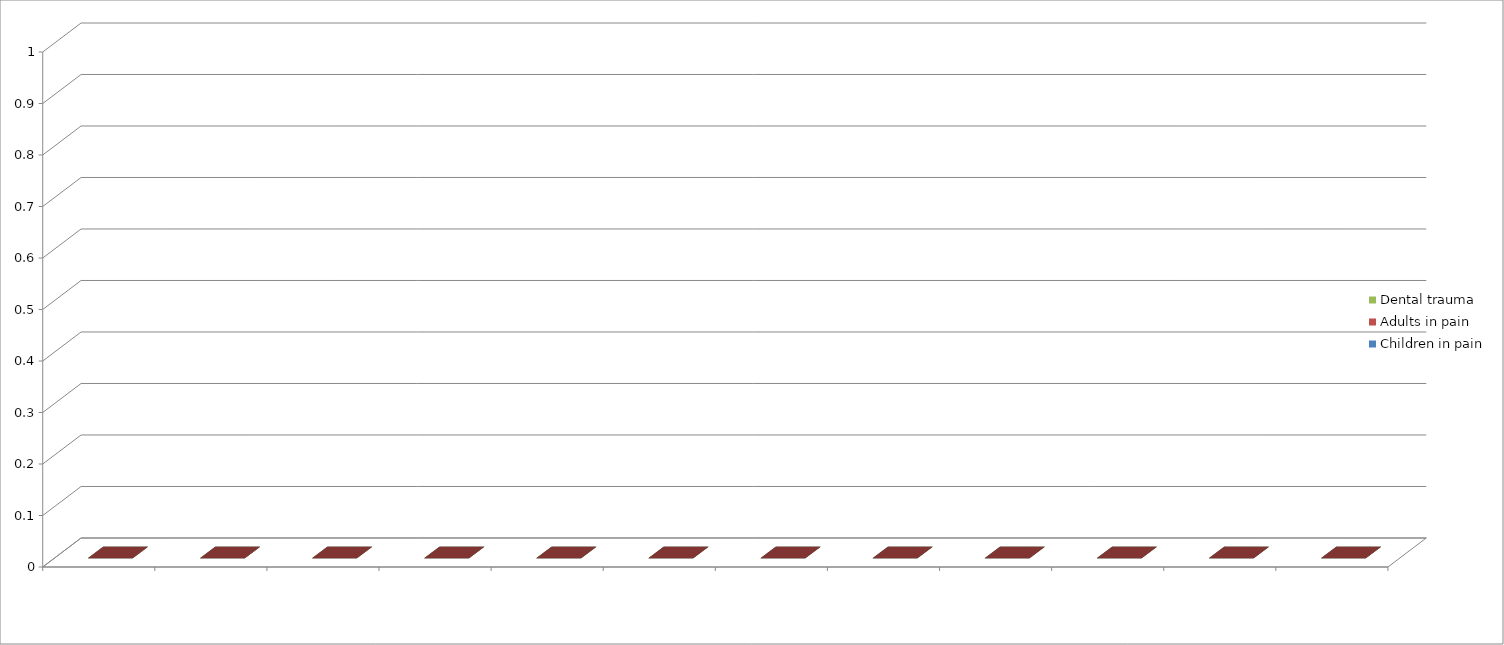
| Category | Children in pain | Adults in pain | Dental trauma |
|---|---|---|---|
| 0 | 0 | 0 | 0 |
| 1 | 0 | 0 | 0 |
| 2 | 0 | 0 | 0 |
| 3 | 0 | 0 | 0 |
| 4 | 0 | 0 | 0 |
| 5 | 0 | 0 | 0 |
| 6 | 0 | 0 | 0 |
| 7 | 0 | 0 | 0 |
| 8 | 0 | 0 | 0 |
| 9 | 0 | 0 | 0 |
| 10 | 0 | 0 | 0 |
| 11 | 0 | 0 | 0 |